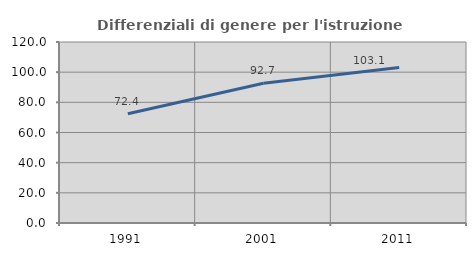
| Category | Differenziali di genere per l'istruzione superiore |
|---|---|
| 1991.0 | 72.434 |
| 2001.0 | 92.679 |
| 2011.0 | 103.085 |